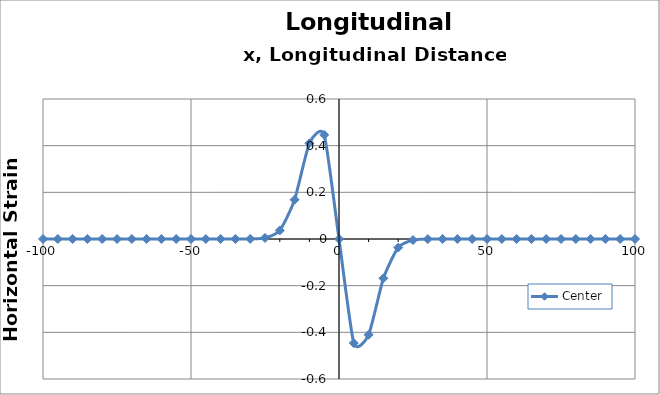
| Category | Center |
|---|---|
| -150.0 | 0 |
| -145.0 | 0 |
| -140.0 | 0 |
| -135.0 | 0 |
| -130.0 | 0 |
| -125.0 | 0 |
| -120.0 | 0 |
| -115.0 | 0 |
| -110.0 | 0 |
| -105.0 | 0 |
| -100.0 | 0 |
| -95.0 | 0 |
| -90.0 | 0 |
| -85.0 | 0 |
| -80.0 | 0 |
| -75.0 | 0 |
| -70.0 | 0 |
| -65.0 | 0 |
| -60.0 | 0 |
| -55.0 | 0 |
| -50.0 | 0 |
| -45.0 | 0 |
| -40.0 | 0 |
| -35.0 | 0 |
| -30.0 | 0 |
| -25.0 | 0.004 |
| -20.0 | 0.037 |
| -15.0 | 0.169 |
| -10.0 | 0.41 |
| -5.0 | 0.446 |
| 0.0 | 0 |
| 5.0 | -0.446 |
| 10.0 | -0.41 |
| 15.0 | -0.169 |
| 20.0 | -0.037 |
| 25.0 | -0.004 |
| 30.0 | 0 |
| 35.0 | 0 |
| 40.0 | 0 |
| 45.0 | 0 |
| 50.0 | 0 |
| 55.0 | 0 |
| 60.0 | 0 |
| 65.0 | 0 |
| 70.0 | 0 |
| 75.0 | 0 |
| 80.0 | 0 |
| 85.0 | 0 |
| 90.0 | 0 |
| 95.0 | 0 |
| 100.0 | 0 |
| 105.0 | 0 |
| 110.0 | 0 |
| 115.0 | 0 |
| 120.0 | 0 |
| 125.0 | 0 |
| 130.0 | 0 |
| 135.0 | 0 |
| 140.0 | 0 |
| 145.0 | 0 |
| 150.0 | 0 |